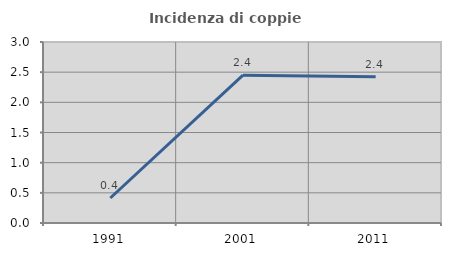
| Category | Incidenza di coppie miste |
|---|---|
| 1991.0 | 0.414 |
| 2001.0 | 2.45 |
| 2011.0 | 2.424 |